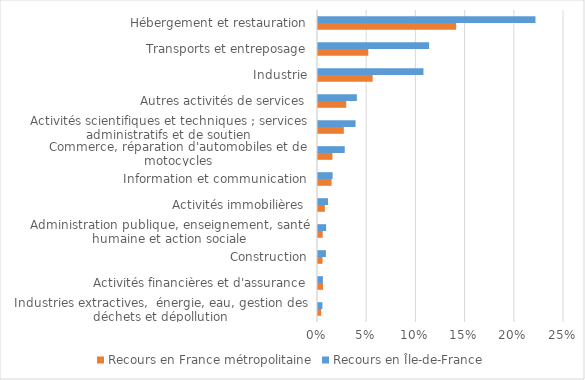
| Category | Recours en France métropolitaine | Recours en Île-de-France |
|---|---|---|
| Industries extractives,  énergie, eau, gestion des déchets et dépollution | 0.003 | 0.004 |
| Activités financières et d'assurance | 0.005 | 0.005 |
| Construction | 0.005 | 0.008 |
| Administration publique, enseignement, santé humaine et action sociale | 0.005 | 0.008 |
| Activités immobilières | 0.007 | 0.01 |
| Information et communication | 0.014 | 0.015 |
| Commerce, réparation d'automobiles et de motocycles | 0.015 | 0.027 |
| Activités scientifiques et techniques ; services administratifs et de soutien | 0.026 | 0.038 |
| Autres activités de services | 0.029 | 0.039 |
| Industrie | 0.056 | 0.107 |
| Transports et entreposage | 0.051 | 0.113 |
| Hébergement et restauration | 0.14 | 0.221 |